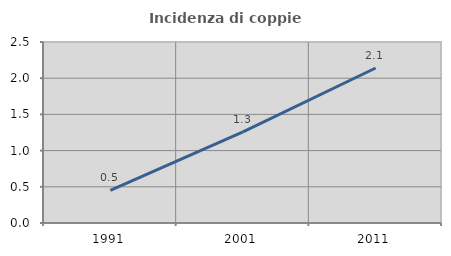
| Category | Incidenza di coppie miste |
|---|---|
| 1991.0 | 0.451 |
| 2001.0 | 1.258 |
| 2011.0 | 2.141 |